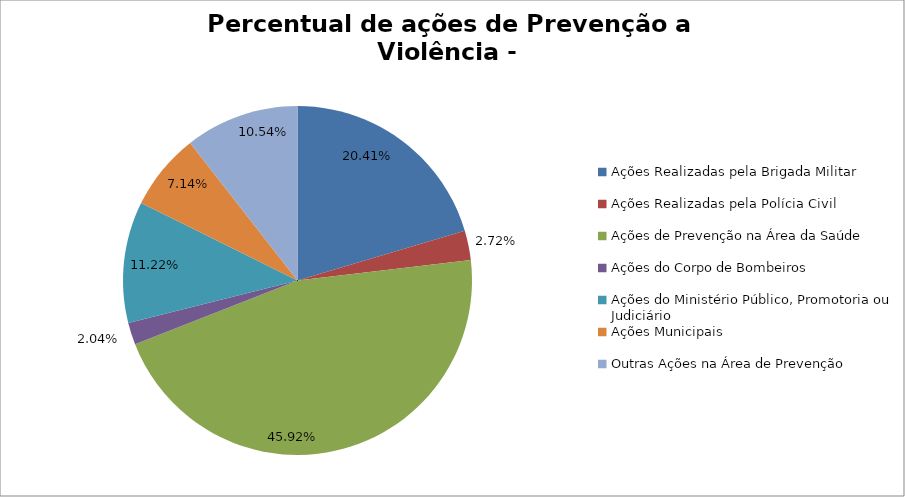
| Category | Percentual |
|---|---|
| Ações Realizadas pela Brigada Militar | 0.204 |
| Ações Realizadas pela Polícia Civil | 0.027 |
| Ações de Prevenção na Área da Saúde | 0.459 |
| Ações do Corpo de Bombeiros | 0.02 |
| Ações do Ministério Público, Promotoria ou Judiciário | 0.112 |
| Ações Municipais | 0.071 |
| Outras Ações na Área de Prevenção | 0.105 |